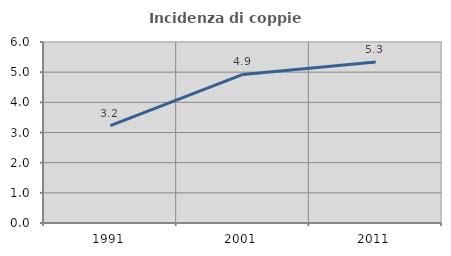
| Category | Incidenza di coppie miste |
|---|---|
| 1991.0 | 3.226 |
| 2001.0 | 4.926 |
| 2011.0 | 5.34 |